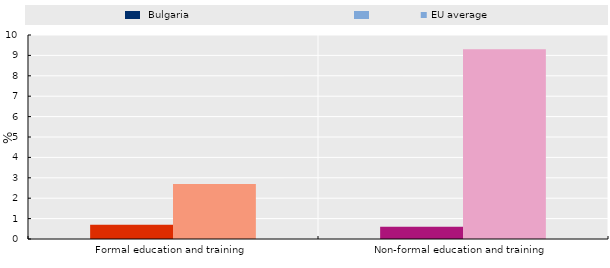
| Category | Bulgaria | EU average |
|---|---|---|
| Formal education and training | 0.7 | 2.7 |
| Non-formal education and training | 0.6 | 9.3 |